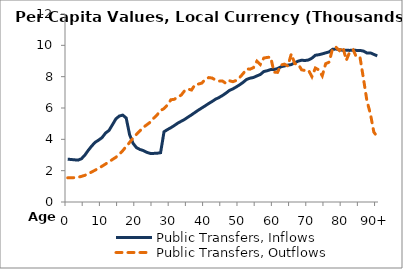
| Category | Public Transfers, Inflows | Public Transfers, Outflows |
|---|---|---|
| 0 | 2733.373 | 1543.519 |
|  | 2712.696 | 1549.018 |
| 2 | 2692.019 | 1554.516 |
| 3 | 2672.312 | 1577.95 |
| 4 | 2762.577 | 1636.019 |
| 5 | 2998.402 | 1704.198 |
| 6 | 3305.125 | 1796.943 |
| 7 | 3581.032 | 1922.861 |
| 8 | 3813.228 | 2034.161 |
| 9 | 3952.562 | 2157.984 |
| 10 | 4114.719 | 2287.722 |
| 11 | 4403.664 | 2424.243 |
| 12 | 4567.546 | 2567.183 |
| 13 | 4929.589 | 2713.131 |
| 14 | 5303.795 | 2853.579 |
| 15 | 5488.427 | 3047.333 |
| 16 | 5544.421 | 3276.969 |
| 17 | 5362.739 | 3541.914 |
| 18 | 4290.248 | 3804.957 |
| 19 | 3743.015 | 4078.404 |
| 20 | 3467.585 | 4318.815 |
| 21 | 3351.826 | 4544.933 |
| 22 | 3280.985 | 4769.364 |
| 23 | 3171.292 | 4930.784 |
| 24 | 3101.058 | 5095.68 |
| 25 | 3102.694 | 5351.683 |
| 26 | 3113.058 | 5561.034 |
| 27 | 3147.593 | 5846.045 |
| 28 | 4482.822 | 5961.084 |
| 29 | 4623.787 | 6196.161 |
| 30 | 4743.017 | 6525.013 |
| 31 | 4882.608 | 6555.424 |
| 32 | 5034.626 | 6711.661 |
| 33 | 5154.383 | 6820.361 |
| 34 | 5273.193 | 7111.672 |
| 35 | 5421.851 | 7208.682 |
| 36 | 5563.479 | 7147.323 |
| 37 | 5716.367 | 7490.429 |
| 38 | 5865.155 | 7528.281 |
| 39 | 6005.528 | 7591.096 |
| 40 | 6142.503 | 7827.037 |
| 41 | 6286.739 | 7941.736 |
| 42 | 6420.402 | 7910.75 |
| 43 | 6564.183 | 7781.374 |
| 44 | 6669.883 | 7716.527 |
| 45 | 6800.584 | 7720.943 |
| 46 | 6950.238 | 7567.484 |
| 47 | 7118.298 | 7741.148 |
| 48 | 7219.038 | 7679.602 |
| 49 | 7345.68 | 7758.656 |
| 50 | 7483.176 | 7949.313 |
| 51 | 7638.952 | 8197.24 |
| 52 | 7823.376 | 8494.25 |
| 53 | 7903.662 | 8478.589 |
| 54 | 7947.839 | 8574.91 |
| 55 | 8048.026 | 8989.423 |
| 56 | 8138.799 | 8776.711 |
| 57 | 8326.926 | 9188.285 |
| 58 | 8379.486 | 9229.22 |
| 59 | 8451.981 | 9244.081 |
| 60 | 8458.59 | 8284.44 |
| 61 | 8515.482 | 8273.229 |
| 62 | 8630.947 | 8749.262 |
| 63 | 8684.012 | 8799.14 |
| 64 | 8735.724 | 8681.554 |
| 65 | 8769.157 | 9451.072 |
| 66 | 8880.187 | 8832.581 |
| 67 | 8991.66 | 8807.77 |
| 68 | 9048.936 | 8436.648 |
| 69 | 9030.787 | 8392.437 |
| 70 | 9064.07 | 8414.058 |
| 71 | 9181.073 | 8000.398 |
| 72 | 9367.076 | 8552.991 |
| 73 | 9400.074 | 8433.857 |
| 74 | 9453.727 | 8054.546 |
| 75 | 9519.435 | 8825.841 |
| 76 | 9580.775 | 8928.106 |
| 77 | 9744.194 | 9788.863 |
| 78 | 9763.641 | 9876.674 |
| 79 | 9718 | 9665.539 |
| 80 | 9683.663 | 9885.557 |
| 81 | 9686.245 | 9046.173 |
| 82 | 9676.692 | 9585.801 |
| 83 | 9694.381 | 9707.957 |
| 84 | 9676.129 | 9219.58 |
| 85 | 9675.901 | 9200.663 |
| 86 | 9631.741 | 7855.773 |
| 87 | 9509.349 | 6439.448 |
| 88 | 9517.729 | 5634.819 |
| 89 | 9421.909 | 4459.916 |
| 90+ | 9326.089 | 4162.096 |